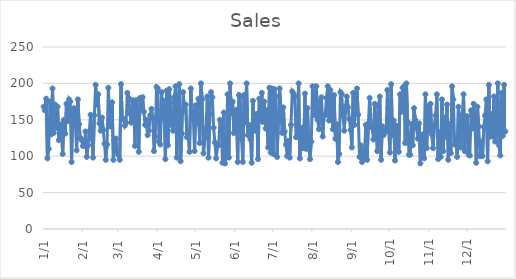
| Category | Sales |
|---|---|
| 2010-01-01 | 168 |
| 2010-01-02 | 163 |
| 2010-01-03 | 179 |
| 2010-01-04 | 97 |
| 2010-01-05 | 110 |
| 2010-01-06 | 175 |
| 2010-01-07 | 130 |
| 2010-01-08 | 193 |
| 2010-01-09 | 132 |
| 2010-01-10 | 171 |
| 2010-01-11 | 139 |
| 2010-01-12 | 168 |
| 2010-01-13 | 122 |
| 2010-01-14 | 129 |
| 2010-01-15 | 144 |
| 2010-01-16 | 103 |
| 2010-01-17 | 150 |
| 2010-01-18 | 131 |
| 2010-01-19 | 172 |
| 2010-01-20 | 148 |
| 2010-01-21 | 178 |
| 2010-01-22 | 175 |
| 2010-01-23 | 92 |
| 2010-01-24 | 161 |
| 2010-01-25 | 166 |
| 2010-01-26 | 146 |
| 2010-01-27 | 108 |
| 2010-01-28 | 178 |
| 2010-01-29 | 144 |
| 2010-01-30 | 125 |
| 2010-01-31 | 122 |
| 2010-02-01 | 114 |
| 2010-02-02 | 115 |
| 2010-02-03 | 134 |
| 2010-02-04 | 99 |
| 2010-02-05 | 115 |
| 2010-02-06 | 134 |
| 2010-02-07 | 157 |
| 2010-02-08 | 124 |
| 2010-02-09 | 98 |
| 2010-02-10 | 156 |
| 2010-02-11 | 198 |
| 2010-02-12 | 171 |
| 2010-02-13 | 185 |
| 2010-02-14 | 145 |
| 2010-02-15 | 135 |
| 2010-02-16 | 153 |
| 2010-02-17 | 136 |
| 2010-02-18 | 117 |
| 2010-02-19 | 95 |
| 2010-02-20 | 116 |
| 2010-02-21 | 194 |
| 2010-02-22 | 141 |
| 2010-02-23 | 141 |
| 2010-02-24 | 174 |
| 2010-02-25 | 95 |
| 2010-02-26 | 122 |
| 2010-02-27 | 124 |
| 2010-02-28 | 106 |
| 2010-03-01 | 101 |
| 2010-03-02 | 95 |
| 2010-03-03 | 199 |
| 2010-03-04 | 151 |
| 2010-03-05 | 151 |
| 2010-03-06 | 142 |
| 2010-03-07 | 146 |
| 2010-03-08 | 187 |
| 2010-03-09 | 180 |
| 2010-03-10 | 159 |
| 2010-03-11 | 146 |
| 2010-03-12 | 177 |
| 2010-03-13 | 170 |
| 2010-03-14 | 114 |
| 2010-03-15 | 177 |
| 2010-03-16 | 151 |
| 2010-03-17 | 106 |
| 2010-03-18 | 180 |
| 2010-03-19 | 166 |
| 2010-03-20 | 181 |
| 2010-03-21 | 161 |
| 2010-03-22 | 143 |
| 2010-03-23 | 150 |
| 2010-03-24 | 129 |
| 2010-03-25 | 135 |
| 2010-03-26 | 156 |
| 2010-03-27 | 165 |
| 2010-03-28 | 153 |
| 2010-03-29 | 107 |
| 2010-03-30 | 127 |
| 2010-03-31 | 195 |
| 2010-04-01 | 193 |
| 2010-04-02 | 120 |
| 2010-04-03 | 116 |
| 2010-04-04 | 188 |
| 2010-04-05 | 152 |
| 2010-04-06 | 176 |
| 2010-04-07 | 96 |
| 2010-04-08 | 190 |
| 2010-04-09 | 115 |
| 2010-04-10 | 192 |
| 2010-04-11 | 174 |
| 2010-04-12 | 143 |
| 2010-04-13 | 135 |
| 2010-04-14 | 181 |
| 2010-04-15 | 196 |
| 2010-04-16 | 98 |
| 2010-04-17 | 177 |
| 2010-04-18 | 199 |
| 2010-04-19 | 93 |
| 2010-04-20 | 131 |
| 2010-04-21 | 188 |
| 2010-04-22 | 163 |
| 2010-04-23 | 171 |
| 2010-04-24 | 126 |
| 2010-04-25 | 132 |
| 2010-04-26 | 106 |
| 2010-04-27 | 193 |
| 2010-04-28 | 163 |
| 2010-04-29 | 152 |
| 2010-04-30 | 107 |
| 2010-05-01 | 170 |
| 2010-05-02 | 145 |
| 2010-05-03 | 179 |
| 2010-05-04 | 118 |
| 2010-05-05 | 200 |
| 2010-05-06 | 178 |
| 2010-05-07 | 104 |
| 2010-05-08 | 125 |
| 2010-05-09 | 138 |
| 2010-05-10 | 182 |
| 2010-05-11 | 98 |
| 2010-05-12 | 158 |
| 2010-05-13 | 188 |
| 2010-05-14 | 181 |
| 2010-05-15 | 139 |
| 2010-05-16 | 119 |
| 2010-05-17 | 97 |
| 2010-05-18 | 115 |
| 2010-05-19 | 115 |
| 2010-05-20 | 150 |
| 2010-05-21 | 146 |
| 2010-05-22 | 91 |
| 2010-05-23 | 160 |
| 2010-05-24 | 90 |
| 2010-05-25 | 101 |
| 2010-05-26 | 185 |
| 2010-05-27 | 98 |
| 2010-05-28 | 200 |
| 2010-05-29 | 159 |
| 2010-05-30 | 175 |
| 2010-05-31 | 132 |
| 2010-06-01 | 134 |
| 2010-06-02 | 164 |
| 2010-06-03 | 92 |
| 2010-06-04 | 184 |
| 2010-06-05 | 182 |
| 2010-06-06 | 124 |
| 2010-06-07 | 92 |
| 2010-06-08 | 184 |
| 2010-06-09 | 146 |
| 2010-06-10 | 200 |
| 2010-06-11 | 129 |
| 2010-06-12 | 143 |
| 2010-06-13 | 123 |
| 2010-06-14 | 91 |
| 2010-06-15 | 176 |
| 2010-06-16 | 145 |
| 2010-06-17 | 135 |
| 2010-06-18 | 158 |
| 2010-06-19 | 96 |
| 2010-06-20 | 179 |
| 2010-06-21 | 149 |
| 2010-06-22 | 187 |
| 2010-06-23 | 147 |
| 2010-06-24 | 175 |
| 2010-06-25 | 138 |
| 2010-06-26 | 163 |
| 2010-06-27 | 112 |
| 2010-06-28 | 194 |
| 2010-06-29 | 105 |
| 2010-06-30 | 193 |
| 2010-07-01 | 103 |
| 2010-07-02 | 192 |
| 2010-07-03 | 182 |
| 2010-07-04 | 99 |
| 2010-07-05 | 146 |
| 2010-07-06 | 193 |
| 2010-07-07 | 167 |
| 2010-07-08 | 132 |
| 2010-07-09 | 167 |
| 2010-07-10 | 134 |
| 2010-07-11 | 116 |
| 2010-07-12 | 100 |
| 2010-07-13 | 121 |
| 2010-07-14 | 98 |
| 2010-07-15 | 143 |
| 2010-07-16 | 189 |
| 2010-07-17 | 186 |
| 2010-07-18 | 182 |
| 2010-07-19 | 126 |
| 2010-07-20 | 141 |
| 2010-07-21 | 200 |
| 2010-07-22 | 97 |
| 2010-07-23 | 136 |
| 2010-07-24 | 139 |
| 2010-07-25 | 111 |
| 2010-07-26 | 186 |
| 2010-07-27 | 110 |
| 2010-07-28 | 166 |
| 2010-07-29 | 116 |
| 2010-07-30 | 96 |
| 2010-07-31 | 120 |
| 2010-08-01 | 196 |
| 2010-08-02 | 186 |
| 2010-08-03 | 156 |
| 2010-08-04 | 196 |
| 2010-08-05 | 150 |
| 2010-08-06 | 137 |
| 2010-08-07 | 176 |
| 2010-08-08 | 181 |
| 2010-08-09 | 127 |
| 2010-08-10 | 155 |
| 2010-08-11 | 157 |
| 2010-08-12 | 180 |
| 2010-08-13 | 196 |
| 2010-08-14 | 149 |
| 2010-08-15 | 191 |
| 2010-08-16 | 180 |
| 2010-08-17 | 137 |
| 2010-08-18 | 184 |
| 2010-08-19 | 124 |
| 2010-08-20 | 144 |
| 2010-08-21 | 92 |
| 2010-08-22 | 103 |
| 2010-08-23 | 188 |
| 2010-08-24 | 185 |
| 2010-08-25 | 156 |
| 2010-08-26 | 135 |
| 2010-08-27 | 168 |
| 2010-08-28 | 182 |
| 2010-08-29 | 167 |
| 2010-08-30 | 151 |
| 2010-08-31 | 136 |
| 2010-09-01 | 112 |
| 2010-09-02 | 187 |
| 2010-09-03 | 143 |
| 2010-09-04 | 177 |
| 2010-09-05 | 193 |
| 2010-09-06 | 157 |
| 2010-09-07 | 99 |
| 2010-09-08 | 115 |
| 2010-09-09 | 92 |
| 2010-09-10 | 108 |
| 2010-09-11 | 96 |
| 2010-09-12 | 143 |
| 2010-09-13 | 95 |
| 2010-09-14 | 145 |
| 2010-09-15 | 180 |
| 2010-09-16 | 143 |
| 2010-09-17 | 139 |
| 2010-09-18 | 123 |
| 2010-09-19 | 172 |
| 2010-09-20 | 140 |
| 2010-09-21 | 107 |
| 2010-09-22 | 169 |
| 2010-09-23 | 182 |
| 2010-09-24 | 95 |
| 2010-09-25 | 141 |
| 2010-09-26 | 129 |
| 2010-09-27 | 135 |
| 2010-09-28 | 134 |
| 2010-09-29 | 191 |
| 2010-09-30 | 136 |
| 2010-10-01 | 105 |
| 2010-10-02 | 199 |
| 2010-10-03 | 129 |
| 2010-10-04 | 149 |
| 2010-10-05 | 94 |
| 2010-10-06 | 142 |
| 2010-10-07 | 129 |
| 2010-10-08 | 106 |
| 2010-10-09 | 185 |
| 2010-10-10 | 161 |
| 2010-10-11 | 194 |
| 2010-10-12 | 196 |
| 2010-10-13 | 118 |
| 2010-10-14 | 200 |
| 2010-10-15 | 147 |
| 2010-10-16 | 102 |
| 2010-10-17 | 102 |
| 2010-10-18 | 144 |
| 2010-10-19 | 115 |
| 2010-10-20 | 166 |
| 2010-10-21 | 150 |
| 2010-10-22 | 139 |
| 2010-10-23 | 124 |
| 2010-10-24 | 145 |
| 2010-10-25 | 90 |
| 2010-10-26 | 123 |
| 2010-10-27 | 130 |
| 2010-10-28 | 97 |
| 2010-10-29 | 185 |
| 2010-10-30 | 111 |
| 2010-10-31 | 168 |
| 2010-11-01 | 135 |
| 2010-11-02 | 172 |
| 2010-11-03 | 130 |
| 2010-11-04 | 111 |
| 2010-11-05 | 143 |
| 2010-11-06 | 156 |
| 2010-11-07 | 185 |
| 2010-11-08 | 96 |
| 2010-11-09 | 133 |
| 2010-11-10 | 99 |
| 2010-11-11 | 178 |
| 2010-11-12 | 107 |
| 2010-11-13 | 153 |
| 2010-11-14 | 127 |
| 2010-11-15 | 171 |
| 2010-11-16 | 95 |
| 2010-11-17 | 144 |
| 2010-11-18 | 104 |
| 2010-11-19 | 196 |
| 2010-11-20 | 178 |
| 2010-11-21 | 116 |
| 2010-11-22 | 126 |
| 2010-11-23 | 99 |
| 2010-11-24 | 168 |
| 2010-11-25 | 137 |
| 2010-11-26 | 112 |
| 2010-11-27 | 157 |
| 2010-11-28 | 185 |
| 2010-11-29 | 107 |
| 2010-11-30 | 150 |
| 2010-12-01 | 155 |
| 2010-12-02 | 102 |
| 2010-12-03 | 101 |
| 2010-12-04 | 163 |
| 2010-12-05 | 138 |
| 2010-12-06 | 172 |
| 2010-12-07 | 148 |
| 2010-12-08 | 91 |
| 2010-12-09 | 168 |
| 2010-12-10 | 141 |
| 2010-12-11 | 100 |
| 2010-12-12 | 120 |
| 2010-12-13 | 100 |
| 2010-12-14 | 140 |
| 2010-12-15 | 156 |
| 2010-12-16 | 178 |
| 2010-12-17 | 93 |
| 2010-12-18 | 198 |
| 2010-12-19 | 127 |
| 2010-12-20 | 158 |
| 2010-12-21 | 127 |
| 2010-12-22 | 182 |
| 2010-12-23 | 120 |
| 2010-12-24 | 130 |
| 2010-12-25 | 200 |
| 2010-12-26 | 115 |
| 2010-12-27 | 101 |
| 2010-12-28 | 187 |
| 2010-12-29 | 128 |
| 2010-12-30 | 198 |
| 2010-12-31 | 134 |